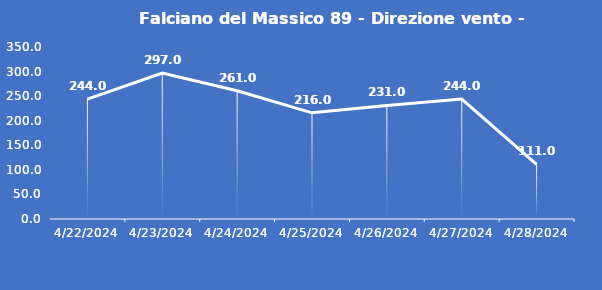
| Category | Falciano del Massico 89 - Direzione vento - Grezzo (°N) |
|---|---|
| 4/22/24 | 244 |
| 4/23/24 | 297 |
| 4/24/24 | 261 |
| 4/25/24 | 216 |
| 4/26/24 | 231 |
| 4/27/24 | 244 |
| 4/28/24 | 111 |